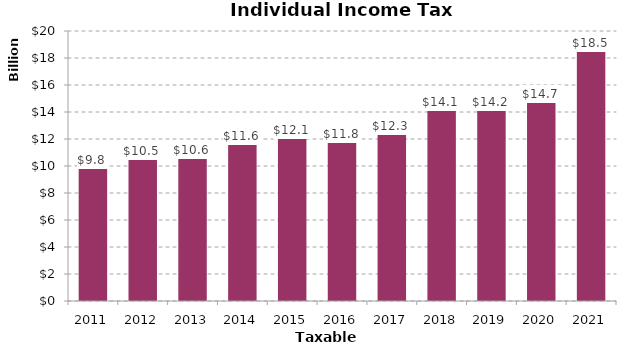
| Category | Amount |
|---|---|
| 2011 | 9846787045 |
| 2012 | 10527113882 |
| 2013 | 10586343685 |
| 2014 | 11623977320 |
| 2015 | 12071058964 |
| 2016 | 11800977144.56 |
| 2017 | 12342418241.27 |
| 2018 | 14112424787.53 |
| 2019 | 14172033140.65 |
| 2020 | 14728931857.1 |
| 2021 | 18548295256.19 |